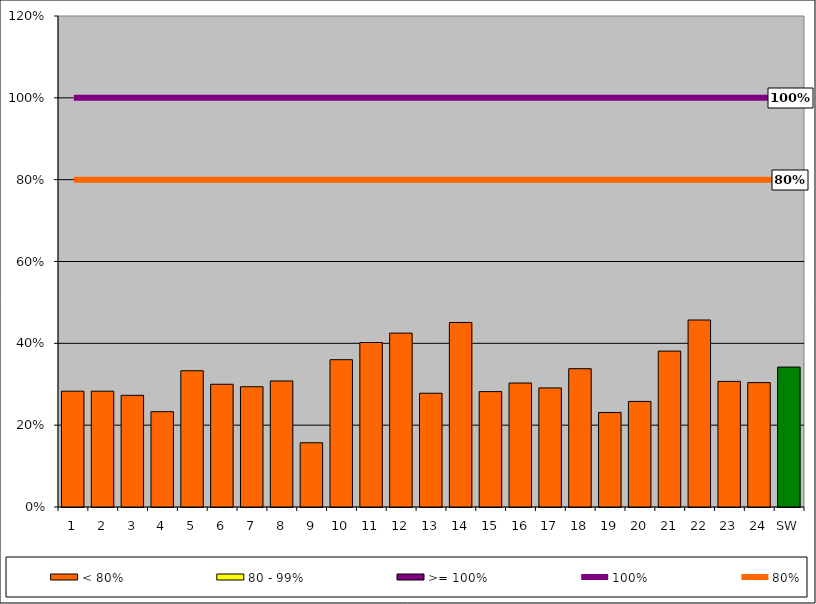
| Category | < 80% | 80 - 99% | >= 100% |
|---|---|---|---|
| 1 | 0.283 | 0 | 0 |
| 2 | 0.283 | 0 | 0 |
| 3 | 0.273 | 0 | 0 |
| 4 | 0.233 | 0 | 0 |
| 5 | 0.333 | 0 | 0 |
| 6 | 0.3 | 0 | 0 |
| 7 | 0.294 | 0 | 0 |
| 8 | 0.308 | 0 | 0 |
| 9 | 0.157 | 0 | 0 |
| 10 | 0.36 | 0 | 0 |
| 11 | 0.402 | 0 | 0 |
| 12 | 0.425 | 0 | 0 |
| 13 | 0.278 | 0 | 0 |
| 14 | 0.451 | 0 | 0 |
| 15 | 0.282 | 0 | 0 |
| 16 | 0.303 | 0 | 0 |
| 17 | 0.291 | 0 | 0 |
| 18 | 0.338 | 0 | 0 |
| 19 | 0.231 | 0 | 0 |
| 20 | 0.258 | 0 | 0 |
| 21 | 0.381 | 0 | 0 |
| 22 | 0.457 | 0 | 0 |
| 23 | 0.307 | 0 | 0 |
| 24 | 0.304 | 0 | 0 |
| SW | 0.342 | 0 | 0 |